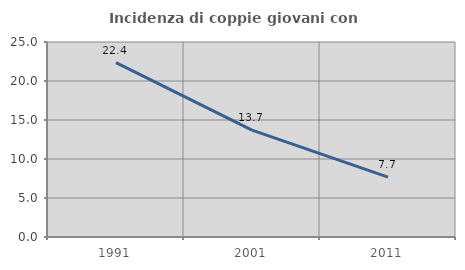
| Category | Incidenza di coppie giovani con figli |
|---|---|
| 1991.0 | 22.356 |
| 2001.0 | 13.708 |
| 2011.0 | 7.675 |